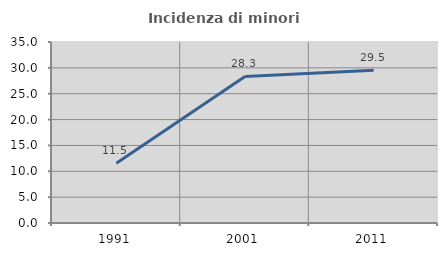
| Category | Incidenza di minori stranieri |
|---|---|
| 1991.0 | 11.538 |
| 2001.0 | 28.333 |
| 2011.0 | 29.515 |